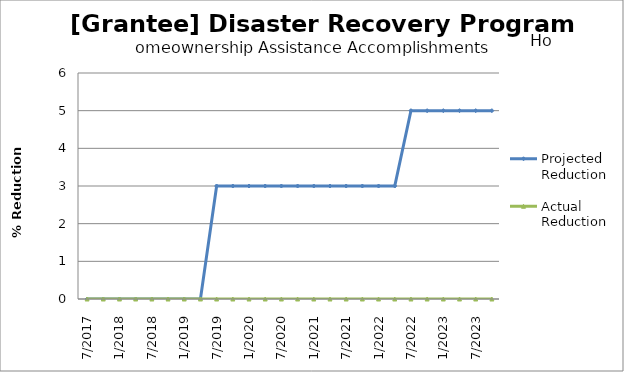
| Category | Projected Reduction | Actual Reduction |
|---|---|---|
| 7/2017 | 0 | 0 |
| 10/2017 | 0 | 0 |
| 1/2018 | 0 | 0 |
| 4/2018 | 0 | 0 |
| 7/2018 | 0 | 0 |
| 10/2018 | 0 | 0 |
| 1/2019 | 0 | 0 |
| 4/2019 | 0 | 0 |
| 7/2019 | 3 | 0 |
| 10/2019 | 3 | 0 |
| 1/2020 | 3 | 0 |
| 4/2020 | 3 | 0 |
| 7/2020 | 3 | 0 |
| 10/2020 | 3 | 0 |
| 1/2021 | 3 | 0 |
| 4/2021 | 3 | 0 |
| 7/2021 | 3 | 0 |
| 10/2021 | 3 | 0 |
| 1/2022 | 3 | 0 |
| 4/2022 | 3 | 0 |
| 7/2022 | 5 | 0 |
| 10/2022 | 5 | 0 |
| 1/2023 | 5 | 0 |
| 4/2023 | 5 | 0 |
| 7/2023 | 5 | 0 |
| 10/2023 | 5 | 0 |